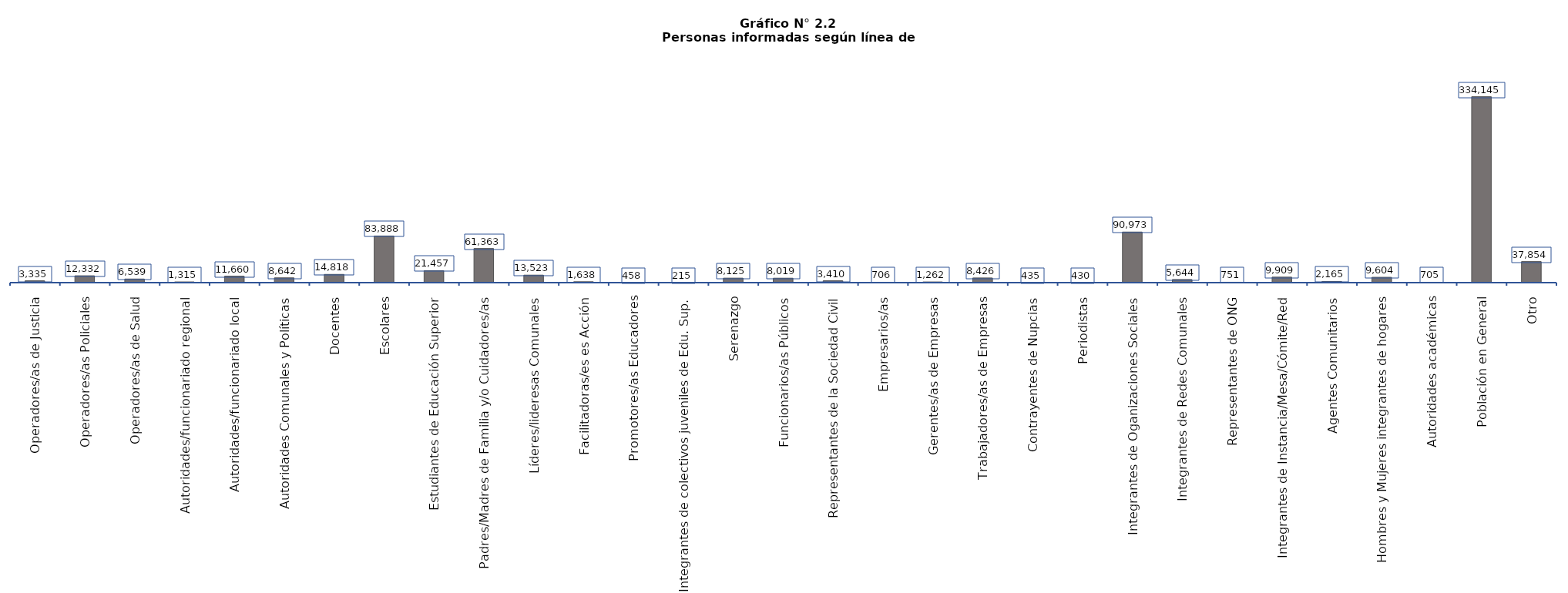
| Category | Series 0 |
|---|---|
| Operadores/as de Justicia | 3335 |
| Operadores/as Policiales | 12332 |
| Operadores/as de Salud | 6539 |
| Autoridades/funcionariado regional | 1315 |
| Autoridades/funcionariado local | 11660 |
| Autoridades Comunales y Políticas | 8642 |
| Docentes | 14818 |
| Escolares | 83888 |
| Estudiantes de Educación Superior | 21457 |
| Padres/Madres de Familia y/o Cuidadores/as | 61363 |
| Líderes/lideresas Comunales | 13523 |
| Facilitadoras/es es Acción | 1638 |
| Promotores/as Educadores | 458 |
| Integrantes de colectivos juveniles de Edu. Sup. | 215 |
| Serenazgo | 8125 |
| Funcionarios/as Públicos | 8019 |
| Representantes de la Sociedad Civil | 3410 |
| Empresarios/as | 706 |
| Gerentes/as de Empresas | 1262 |
| Trabajadores/as de Empresas | 8426 |
| Contrayentes de Nupcias | 435 |
| Periodistas | 430 |
| Integrantes de Oganizaciones Sociales | 90973 |
| Integrantes de Redes Comunales | 5644 |
| Representantes de ONG | 751 |
| Integrantes de Instancia/Mesa/Cómite/Red | 9909 |
| Agentes Comunitarios | 2165 |
| Hombres y Mujeres integrantes de hogares | 9604 |
| Autoridades académicas | 705 |
| Población en General | 334145 |
| Otro | 37854 |